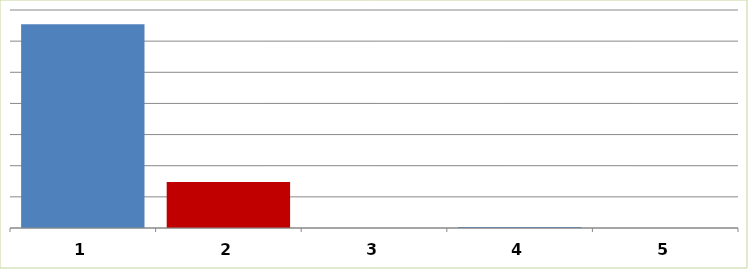
| Category | Series 0 |
|---|---|
| 0 | 65427243 |
| 1 | 14775661 |
| 2 | 0 |
| 3 | 300000 |
| 4 | 0 |